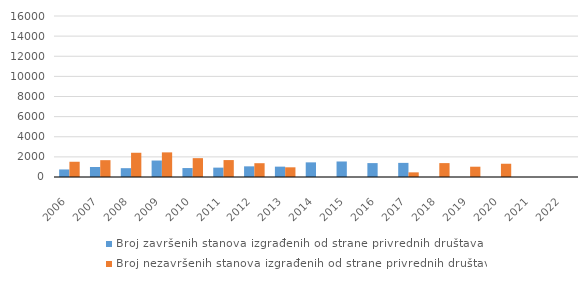
| Category | Broj završenih stanova izgrađenih od strane privrednih društava  | Broj nezavršenih stanova izgrađenih od strane privrednih društava  |
|---|---|---|
| 2006.0 | 749 | 1515 |
| 2007.0 | 995 | 1673 |
| 2008.0 | 877 | 2409 |
| 2009.0 | 1637 | 2447 |
| 2010.0 | 890 | 1873 |
| 2011.0 | 931 | 1682 |
| 2012.0 | 1059 | 1371 |
| 2013.0 | 1029 | 963 |
| 2014.0 | 1455 | 0 |
| 2015.0 | 1542 | 0 |
| 2016.0 | 1381 | 0 |
| 2017.0 | 1403 | 462 |
| 2018.0 | 0 | 1381 |
| 2019.0 | 0 | 1023 |
| 2020.0 | 0 | 1317 |
| 2021.0 | 0 | 0 |
| 2022.0 | 0 | 0 |